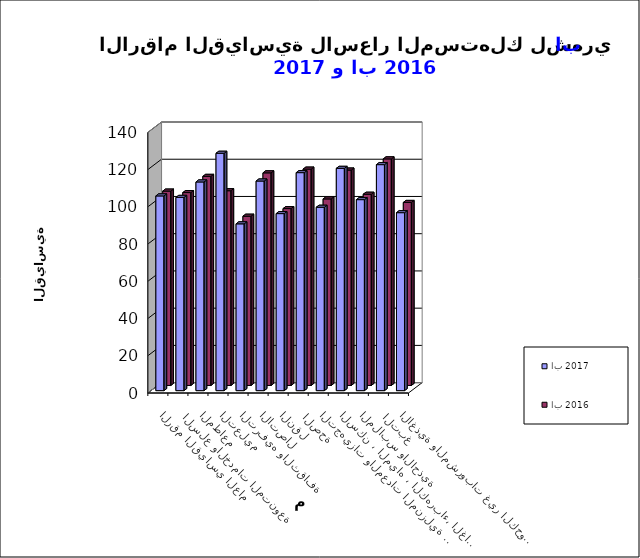
| Category | اب 2017      | اب 2016 |
|---|---|---|
| الاغذية والمشروبات غير الكحولية | 95.6 | 98.3 |
|  التبغ | 121.4 | 121.7 |
| الملابس والاحذية | 102.6 | 102.7 |
| السكن ، المياه ، الكهرباء، الغاز  | 119.4 | 115.7 |
| التجهيزات والمعدات المنزلية والصيانة | 98.5 | 100.2 |
|  الصحة | 117.1 | 116.2 |
| النقل | 95.1 | 95 |
| الاتصال | 112.6 | 114.2 |
| الترفيه والثقافة | 89.6 | 90.9 |
| التعليم | 127.5 | 104.6 |
| المطاعم  | 112.1 | 112.3 |
|  السلع والخدمات المتنوعة | 103.8 | 103.6 |
| الرقم القياسي العام | 104.6 | 104.4 |